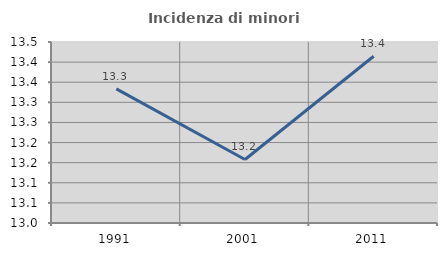
| Category | Incidenza di minori stranieri |
|---|---|
| 1991.0 | 13.333 |
| 2001.0 | 13.158 |
| 2011.0 | 13.415 |